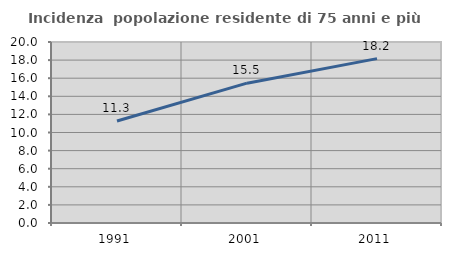
| Category | Incidenza  popolazione residente di 75 anni e più |
|---|---|
| 1991.0 | 11.276 |
| 2001.0 | 15.451 |
| 2011.0 | 18.163 |